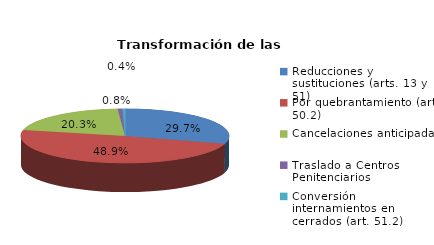
| Category | Series 0 |
|---|---|
| Reducciones y sustituciones (arts. 13 y 51) | 79 |
| Por quebrantamiento (art. 50.2) | 130 |
| Cancelaciones anticipadas | 54 |
| Traslado a Centros Penitenciarios | 2 |
| Conversión internamientos en cerrados (art. 51.2) | 1 |